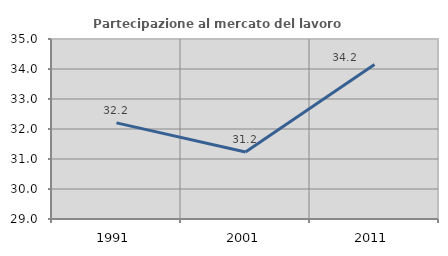
| Category | Partecipazione al mercato del lavoro  femminile |
|---|---|
| 1991.0 | 32.204 |
| 2001.0 | 31.233 |
| 2011.0 | 34.151 |